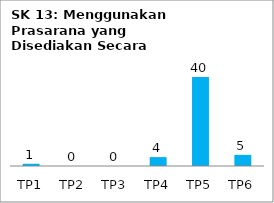
| Category | Bil Pel |
|---|---|
| TP1 | 1 |
| TP2 | 0 |
| TP3 | 0 |
| TP4 | 4 |
| TP5 | 40 |
| TP6 | 5 |